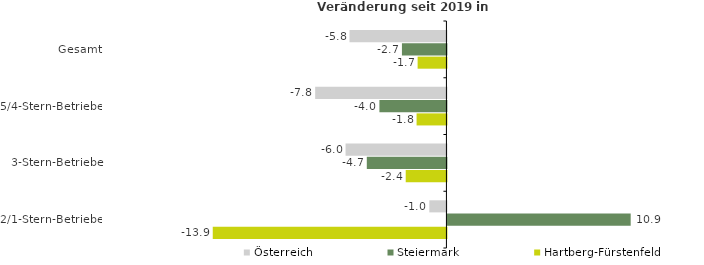
| Category | Österreich | Steiermark | Hartberg-Fürstenfeld |
|---|---|---|---|
| Gesamt | -5.779 | -2.653 | -1.718 |
| 5/4-Stern-Betriebe | -7.825 | -3.996 | -1.78 |
| 3-Stern-Betriebe | -6.014 | -4.748 | -2.428 |
| 2/1-Stern-Betriebe | -1.021 | 10.926 | -13.933 |